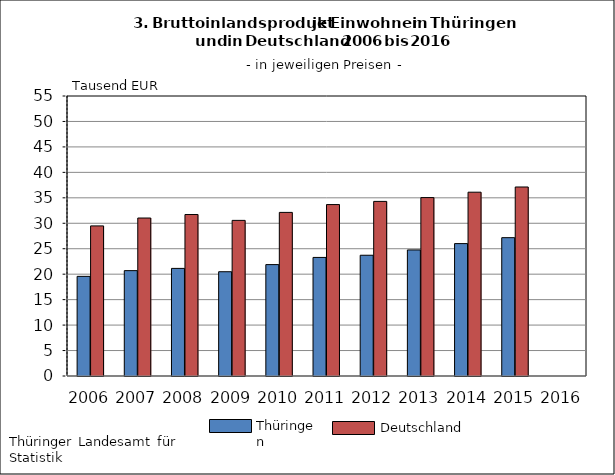
| Category | Series 0 | Series 1 |
|---|---|---|
| 2006.0 | 19.575 | 29.483 |
| 2007.0 | 20.696 | 31.03 |
| 2008.0 | 21.135 | 31.719 |
| 2009.0 | 20.482 | 30.569 |
| 2010.0 | 21.883 | 32.137 |
| 2011.0 | 23.291 | 33.673 |
| 2012.0 | 23.719 | 34.296 |
| 2013.0 | 24.76 | 35.045 |
| 2014.0 | 26.008 | 36.106 |
| 2015.0 | 27.172 | 37.128 |
| 2016.0 | 0 | 0 |